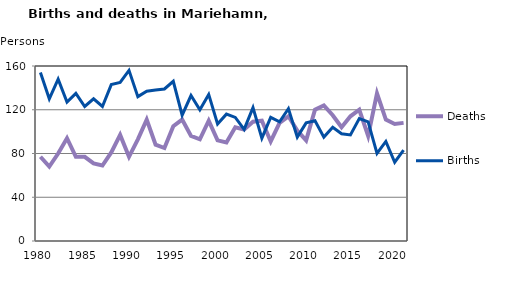
| Category | Deaths | Births |
|---|---|---|
| 1980.0 | 77 | 154 |
| 1981.0 | 68 | 130 |
| 1982.0 | 80 | 148 |
| 1983.0 | 94 | 127 |
| 1984.0 | 77 | 135 |
| 1985.0 | 77 | 123 |
| 1986.0 | 71 | 130 |
| 1987.0 | 69 | 123 |
| 1988.0 | 81 | 143 |
| 1989.0 | 97 | 145 |
| 1990.0 | 77 | 156 |
| 1991.0 | 93 | 132 |
| 1992.0 | 111 | 137 |
| 1993.0 | 88 | 138 |
| 1994.0 | 85 | 139 |
| 1995.0 | 105 | 146 |
| 1996.0 | 111 | 115 |
| 1997.0 | 96 | 133 |
| 1998.0 | 93 | 120 |
| 1999.0 | 110 | 134 |
| 2000.0 | 92 | 107 |
| 2001.0 | 90 | 116 |
| 2002.0 | 104 | 113 |
| 2003.0 | 102 | 102 |
| 2004.0 | 109 | 122 |
| 2005.0 | 110 | 94 |
| 2006.0 | 91 | 113 |
| 2007.0 | 108 | 109 |
| 2008.0 | 114 | 121 |
| 2009.0 | 101 | 95 |
| 2010.0 | 92 | 108 |
| 2011.0 | 120 | 110 |
| 2012.0 | 124 | 95 |
| 2013.0 | 115 | 104 |
| 2014.0 | 104 | 98 |
| 2015.0 | 114 | 97 |
| 2016.0 | 120 | 112 |
| 2017.0 | 96 | 109 |
| 2018.0 | 135 | 80 |
| 2019.0 | 111 | 91 |
| 2020.0 | 107 | 72 |
| 2021.0 | 108 | 83 |